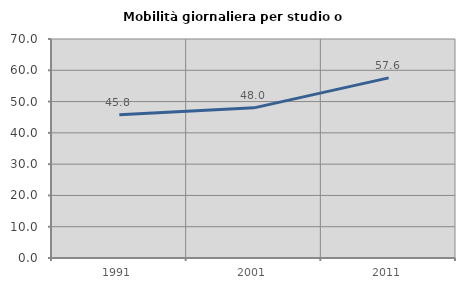
| Category | Mobilità giornaliera per studio o lavoro |
|---|---|
| 1991.0 | 45.791 |
| 2001.0 | 47.987 |
| 2011.0 | 57.576 |